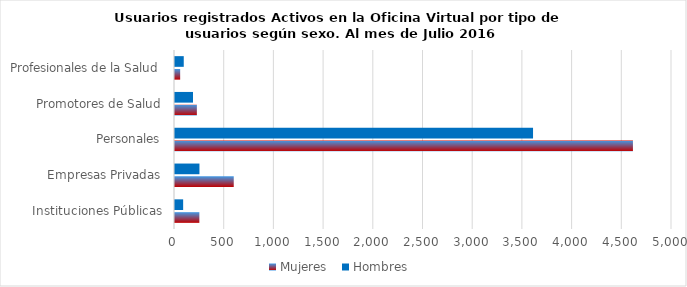
| Category | Mujeres | Hombres |
|---|---|---|
| Instituciones Públicas | 245 | 82 |
| Empresas Privadas | 591 | 246 |
| Personales | 4607 | 3602 |
| Promotores de Salud | 220 | 181 |
| Profesionales de la Salud | 52 | 88 |